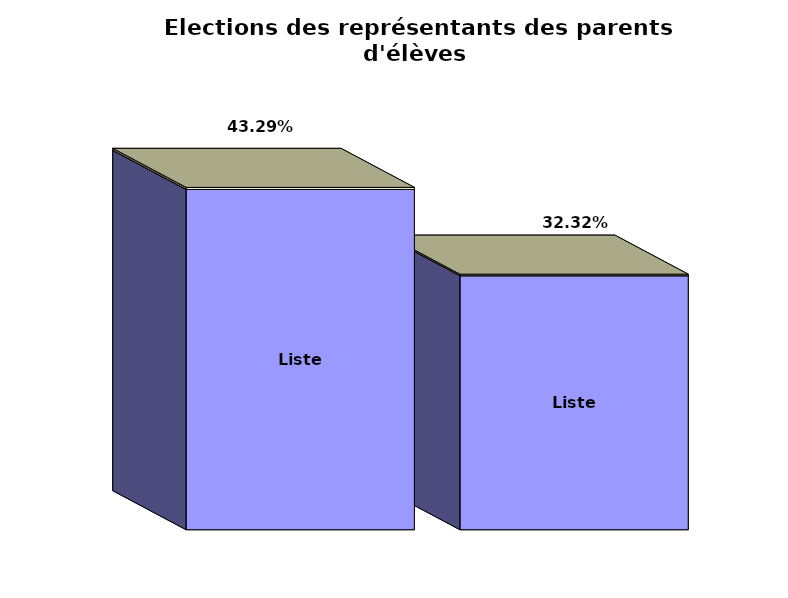
| Category | Series 1 | Series 0 | Series 2 |
|---|---|---|---|
| Liste 1 |  | 71 | 0.433 |
| Liste 2 |  | 53 | 0.323 |